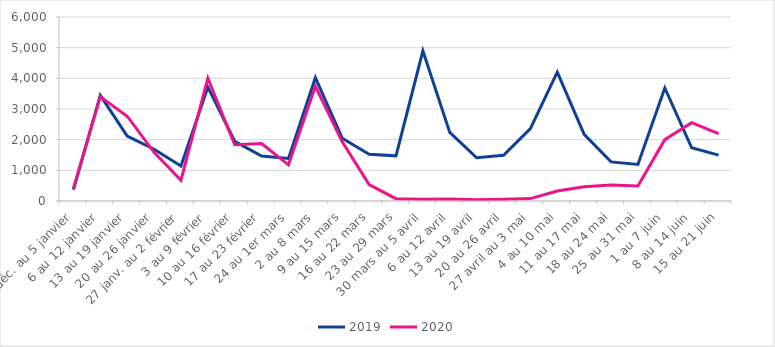
| Category | 2019 | 2020 |
|---|---|---|
| 30 déc. au 5 janvier | 369 | 411 |
| 6 au 12 janvier | 3446 | 3403 |
| 13 au 19 janvier | 2117 | 2765 |
| 20 au 26 janvier | 1689 | 1588 |
| 27 janv. au 2 février | 1140 | 678 |
| 3 au 9 février | 3711 | 4004 |
| 10 au 16 février | 1947 | 1835 |
| 17 au 23 février | 1464 | 1875 |
| 24 au 1er mars | 1389 | 1180 |
| 2 au 8 mars | 4019 | 3741 |
| 9 au 15 mars | 2049 | 1930 |
| 16 au 22 mars | 1525 | 536 |
| 23 au 29 mars | 1473 | 75 |
| 30 mars au 5 avril | 4896 | 61 |
| 6 au 12 avril | 2237 | 69 |
| 13 au 19 avril | 1410 | 40 |
| 20 au 26 avril | 1489 | 60 |
| 27 avril au 3 mai | 2361 | 79 |
| 4 au 10 mai | 4200 | 325 |
| 11 au 17 mai | 2172 | 463 |
| 18 au 24 mai | 1275 | 518 |
| 25 au 31 mai | 1190 | 489 |
| 1 au 7 juin | 3685 | 2001 |
| 8 au 14 juin | 1736 | 2554 |
| 15 au 21 juin | 1497 | 2197 |